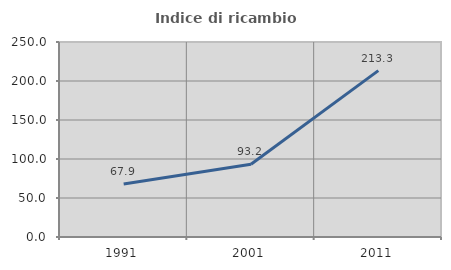
| Category | Indice di ricambio occupazionale  |
|---|---|
| 1991.0 | 67.879 |
| 2001.0 | 93.168 |
| 2011.0 | 213.333 |